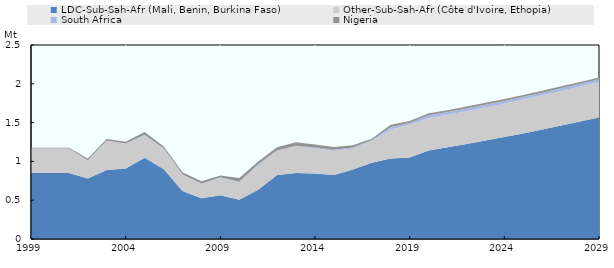
| Category | LDC-Sub-Sah-Afr (Mali, Benin, Burkina Faso) | Other-Sub-Sah-Afr (Côte d'Ivoire, Ethopia) | South Africa | Nigeria |
|---|---|---|---|---|
| 1999.0 | 0.85 | 0.315 | 0 | 0.011 |
| 2000.0 | 0.85 | 0.315 | 0 | 0.011 |
| 2001.0 | 0.85 | 0.315 | 0 | 0.011 |
| 2002.0 | 0.778 | 0.237 | 0 | 0.022 |
| 2003.0 | 0.888 | 0.38 | 0 | 0.02 |
| 2004.0 | 0.908 | 0.322 | 0 | 0.025 |
| 2005.0 | 1.046 | 0.289 | 0.009 | 0.035 |
| 2006.0 | 0.902 | 0.262 | 0.008 | 0.023 |
| 2007.0 | 0.617 | 0.211 | 0.006 | 0.026 |
| 2008.0 | 0.524 | 0.184 | 0.007 | 0.028 |
| 2009.0 | 0.563 | 0.227 | 0.007 | 0.02 |
| 2010.0 | 0.505 | 0.227 | 0.007 | 0.047 |
| 2011.0 | 0.636 | 0.315 | 0.016 | 0.032 |
| 2012.0 | 0.826 | 0.31 | 0.007 | 0.04 |
| 2013.0 | 0.851 | 0.345 | 0.003 | 0.047 |
| 2014.0 | 0.846 | 0.326 | 0.007 | 0.038 |
| 2015.0 | 0.826 | 0.308 | 0.014 | 0.037 |
| 2016.0 | 0.895 | 0.275 | 0.009 | 0.031 |
| 2017.0 | 0.981 | 0.284 | 0.007 | 0.02 |
| 2018.0 | 1.037 | 0.376 | 0.031 | 0.029 |
| 2019.0 | 1.05 | 0.421 | 0.024 | 0.025 |
| 2020.0 | 1.14 | 0.42 | 0.035 | 0.025 |
| 2021.0 | 1.181 | 0.42 | 0.035 | 0.025 |
| 2022.0 | 1.224 | 0.423 | 0.035 | 0.025 |
| 2023.0 | 1.268 | 0.427 | 0.035 | 0.025 |
| 2024.0 | 1.313 | 0.431 | 0.035 | 0.025 |
| 2025.0 | 1.361 | 0.436 | 0.035 | 0.025 |
| 2026.0 | 1.41 | 0.441 | 0.035 | 0.025 |
| 2027.0 | 1.462 | 0.446 | 0.035 | 0.025 |
| 2028.0 | 1.513 | 0.451 | 0.036 | 0.025 |
| 2029.0 | 1.566 | 0.457 | 0.036 | 0.025 |